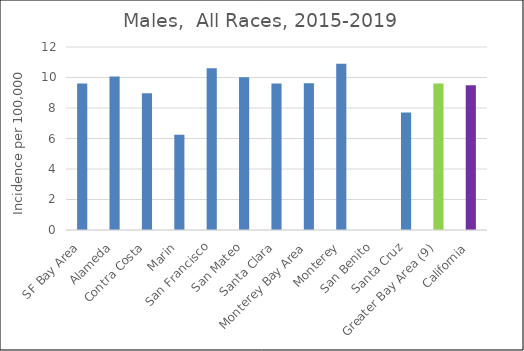
| Category | Male |
|---|---|
| SF Bay Area | 9.6 |
|   Alameda | 10.07 |
|   Contra Costa | 8.96 |
|   Marin | 6.25 |
|   San Francisco | 10.61 |
|   San Mateo | 10.02 |
|   Santa Clara | 9.61 |
| Monterey Bay Area | 9.62 |
|   Monterey | 10.9 |
|   San Benito | 0 |
|   Santa Cruz | 7.71 |
| Greater Bay Area (9) | 9.61 |
| California | 9.49 |